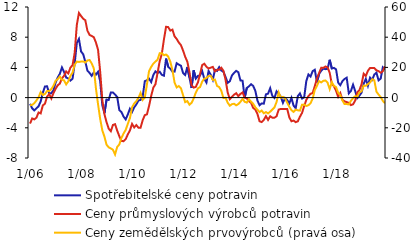
| Category | Spotřebitelské ceny potravin | Ceny průmyslových výrobců potravin |
|---|---|---|
|  1/06 | -0.828 | -3.441 |
| 2 | -1.421 | -2.759 |
| 3 | -1.696 | -2.882 |
| 4 | -1.43 | -2.661 |
| 5 | -1.15 | -1.973 |
| 6 | -0.503 | -2.091 |
| 7 | 0.647 | -1.04 |
| 8 | 1.471 | -0.808 |
| 9 | 1.502 | 0.116 |
| 10 | 0.554 | 0.462 |
| 11 | 0.57 | -0.116 |
| 12 | 0.968 | 0.583 |
|  1/07 | 1.971 | 1.16 |
| 2 | 2.65 | 1.619 |
| 3 | 3.141 | 1.854 |
| 4 | 3.997 | 2.546 |
| 5 | 3.39 | 2.889 |
| 6 | 2.654 | 3.461 |
| 7 | 2.532 | 3.2 |
| 8 | 2.252 | 3.976 |
| 9 | 2.508 | 4.294 |
| 10 | 4.533 | 5.927 |
| 11 | 7.242 | 9.626 |
| 12 | 7.772 | 11.208 |
|  1/08 | 6.105 | 10.812 |
| 2 | 5.751 | 10.444 |
| 3 | 4.746 | 10.249 |
| 4 | 3.573 | 8.853 |
| 5 | 3.267 | 8.302 |
| 6 | 2.885 | 8.161 |
| 7 | 3.338 | 7.996 |
| 8 | 3.038 | 7.299 |
| 9 | 3.424 | 6.322 |
| 10 | 2.16 | 3.415 |
| 11 | -1.008 | -0.317 |
| 12 | -2.068 | -2.207 |
|  1/09 | -0.256 | -3.262 |
| 2 | -0.312 | -4.112 |
| 3 | 0.672 | -4.45 |
| 4 | 0.673 | -3.621 |
| 5 | 0.405 | -3.52 |
| 6 | 0.081 | -4.379 |
| 7 | -1.648 | -5.113 |
| 8 | -1.916 | -5.752 |
| 9 | -2.513 | -5.771 |
| 10 | -2.887 | -5.5 |
| 11 | -2.231 | -4.879 |
| 12 | -1.468 | -4.344 |
|  1/10 | -1.902 | -3.482 |
| 2 | -1.296 | -3.952 |
| 3 | -0.908 | -3.641 |
| 4 | -0.388 | -3.983 |
| 5 | -0.309 | -3.987 |
| 6 | 0.127 | -2.992 |
| 7 | 2.177 | -2.322 |
| 8 | 2.294 | -2.217 |
| 9 | 2.51 | -1.106 |
| 10 | 2.054 | 0.221 |
| 11 | 2.989 | 1.325 |
| 12 | 3.475 | 1.76 |
|  1/11 | 3.256 | 3.268 |
| 2 | 3.427 | 4.81 |
| 3 | 3.015 | 5.784 |
| 4 | 2.898 | 7.709 |
| 5 | 5.166 | 9.377 |
| 6 | 4.073 | 9.337 |
| 7 | 3.827 | 8.878 |
| 8 | 3.443 | 9 |
| 9 | 3.441 | 8.115 |
| 10 | 4.551 | 7.766 |
| 11 | 4.369 | 7.293 |
| 12 | 4.224 | 6.95 |
|  1/12 | 3.258 | 6.233 |
| 2 | 2.991 | 5.401 |
| 3 | 4.047 | 4.763 |
| 4 | 2.666 | 3.39 |
| 5 | 1.279 | 1.633 |
| 6 | 3.62 | 1.323 |
| 7 | 2.522 | 1.423 |
| 8 | 2.878 | 2.028 |
| 9 | 2.924 | 3.13 |
| 10 | 3.51 | 4.307 |
| 11 | 2.475 | 4.485 |
| 12 | 1.995 | 4.086 |
|  1/13 | 3.52 | 3.852 |
| 2 | 3.044 | 3.965 |
| 3 | 2.366 | 4.062 |
| 4 | 3.689 | 3.474 |
| 5 | 3.538 | 3.677 |
| 6 | 4.036 | 3.673 |
| 7 | 3.59 | 3.957 |
| 8 | 3.416 | 3.551 |
| 9 | 2.734 | 2.358 |
| 10 | 1.957 | 0.684 |
| 11 | 2.165 | -0.195 |
| 12 | 2.927 | 0.098 |
|  1/14 | 3.276 | 0.387 |
| 2 | 3.535 | 0.581 |
| 3 | 3.362 | 0.194 |
| 4 | 2.273 | 0.487 |
| 5 | 2.236 | 0.681 |
| 6 | -0.023 | 0 |
| 7 | 1.279 | -0.097 |
| 8 | 1.49 | -0.486 |
| 9 | 1.774 | -0.682 |
| 10 | 1.546 | -1.373 |
| 11 | 0.903 | -1.575 |
| 12 | -0.395 | -2.17 |
|  1/15 | -1.011 | -3.138 |
| 2 | -0.772 | -3.24 |
| 3 | -0.801 | -2.95 |
| 4 | 0.433 | -2.457 |
| 5 | 0.526 | -2.95 |
| 6 | 1.244 | -2.467 |
| 7 | 0.226 | -2.656 |
| 8 | -0.052 | -2.664 |
| 9 | 0.831 | -2.474 |
| 10 | 0.504 | -1.592 |
| 11 | 0.114 | -1.499 |
| 12 | -0.693 | -1.507 |
|  1/16 | -0.062 | -1.505 |
| 2 | -0.32 | -1.508 |
| 3 | -0.765 | -2.629 |
| 4 | -0.032 | -3.133 |
| 5 | -1.057 | -3.04 |
| 6 | -1.408 | -3.249 |
| 7 | 0.197 | -3.139 |
| 8 | 0.554 | -2.532 |
| 9 | -0.132 | -2.024 |
| 10 | 0.038 | -1.109 |
| 11 | 2.196 | -0.303 |
| 12 | 3.065 | 0.202 |
|  1/17 | 2.797 | 0.504 |
| 2 | 3.514 | 0.606 |
| 3 | 3.686 | 1.525 |
| 4 | 2.026 | 2.534 |
| 5 | 3.121 | 3.239 |
| 6 | 3.544 | 3.946 |
| 7 | 3.84 | 3.934 |
| 8 | 3.766 | 4.119 |
| 9 | 3.807 | 4.009 |
| 10 | 5.012 | 3.292 |
| 11 | 3.854 | 1.802 |
| 12 | 3.932 | 1.504 |
|  1/18 | 3.748 | 0.901 |
| 2 | 1.976 | 0.101 |
| 3 | 1.638 | 0.604 |
| 4 | 2.192 | -0.301 |
| 5 | 2.463 | -0.499 |
| 6 | 2.637 | -0.597 |
| 7 | 0.567 | -0.695 |
| 8 | 0.878 | -0.989 |
| 9 | 1.706 | -0.888 |
| 10 | 0.864 | -0.393 |
| 11 | -0.069 | 0.692 |
| 12 | 0.264 | 0.99 |
|  1/19 | 0.657 | 1.779 |
| 2 | 1.833 | 3.169 |
| 3 | 2.48 | 2.867 |
| 4 | 1.569 | 3.551 |
| 5 | 2.65 | 3.926 |
| 6 | 2.356 | 3.914 |
| 7 | 3.053 | 3.907 |
| 8 | 3.3 | 3.612 |
| 9 | 2.286 | 3.506 |
| 10 | 2.52 | 3.295 |
| 11 | 4.013 | 3.485 |
| 12 | 3.715 | 4.149 |